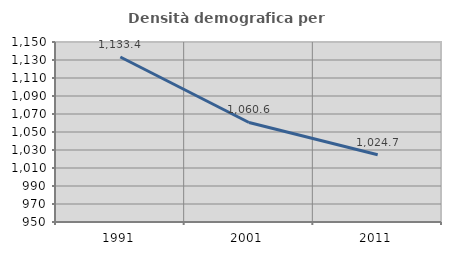
| Category | Densità demografica |
|---|---|
| 1991.0 | 1133.358 |
| 2001.0 | 1060.564 |
| 2011.0 | 1024.735 |